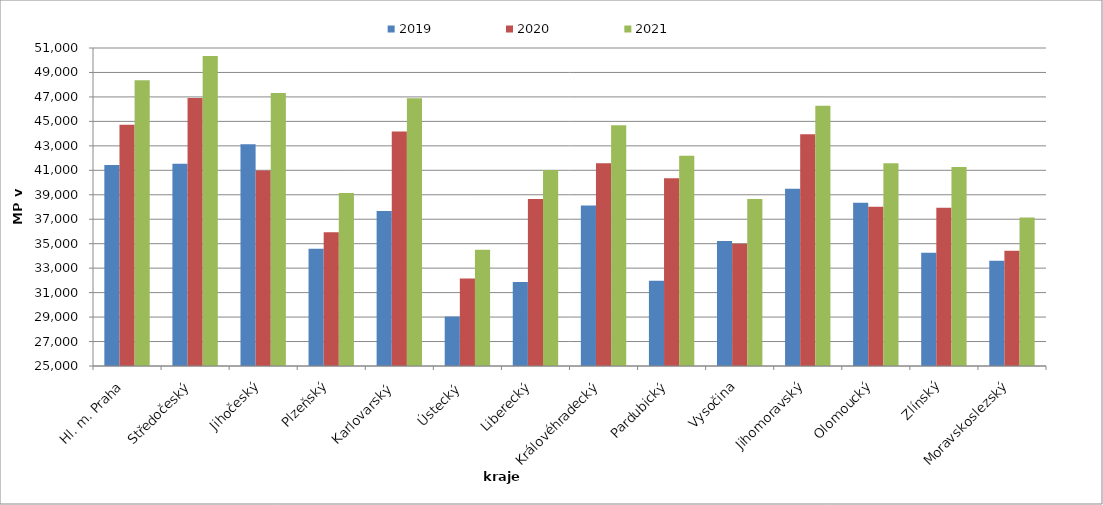
| Category | 2019 | 2020 | 2021 |
|---|---|---|---|
| Hl. m. Praha | 41441.213 | 44719.354 | 48369.152 |
| Středočeský | 41546.322 | 46915.92 | 50351.994 |
| Jihočeský | 43122.394 | 40991.32 | 47318.685 |
| Plzeňský | 34593.958 | 35934.628 | 39149.043 |
| Karlovarský  | 37673.563 | 44180 | 46899.512 |
| Ústecký   | 29044.472 | 32146.47 | 34496.969 |
| Liberecký | 31870.78 | 38661.406 | 41032.298 |
| Královéhradecký | 38125.925 | 41570.374 | 44693.321 |
| Pardubický | 31979.016 | 40356.762 | 42192.576 |
| Vysočina | 35225.661 | 35005.301 | 38659.983 |
| Jihomoravský | 39494.946 | 43956.006 | 46271.346 |
| Olomoucký | 38341.71 | 38020.683 | 41576.162 |
| Zlínský | 34257.023 | 37934.812 | 41269.428 |
| Moravskoslezský | 33608.171 | 34428.105 | 37144.121 |